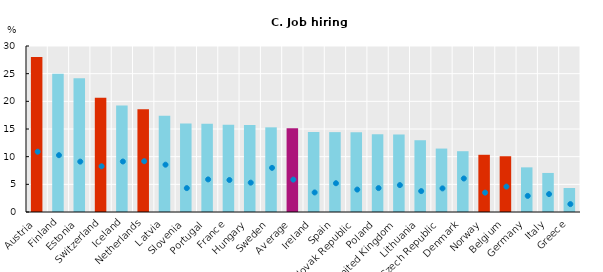
| Category | People without disability |
|---|---|
| Austria | 28.011 |
| Finland | 24.981 |
| Estonia | 24.15 |
| Switzerland | 20.67 |
| Iceland | 19.266 |
| Netherlands | 18.565 |
| Latvia | 17.407 |
| Slovenia | 15.975 |
| Portugal | 15.97 |
| France | 15.775 |
| Hungary | 15.731 |
| Sweden | 15.302 |
| Average | 15.138 |
| Ireland | 14.446 |
| Spain | 14.436 |
| Slovak Republic | 14.414 |
| Poland | 14.059 |
| United Kingdom | 14.008 |
| Lithuania | 12.969 |
| Czech Republic | 11.466 |
| Denmark | 10.986 |
| Norway | 10.34 |
| Belgium | 10.077 |
| Germany | 8.067 |
| Italy | 7.057 |
| Greece | 4.335 |